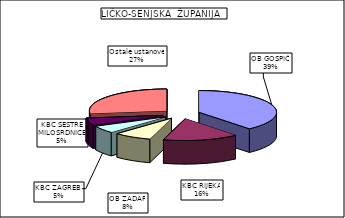
| Category | Series 0 |
|---|---|
| OB GOSPIĆ | 38.74 |
| KBC RIJEKA | 15.786 |
| OB ZADAR | 7.887 |
| KBC ZAGREB  | 5.485 |
| KBC SESTRE MILOSRDNICE | 5.126 |
| Ostale ustanove | 26.978 |